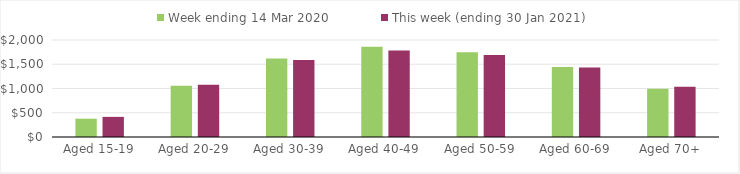
| Category | Week ending 14 Mar 2020 | This week (ending 30 Jan 2021) |
|---|---|---|
| Aged 15-19 | 377.62 | 414.75 |
| Aged 20-29 | 1058.94 | 1078.39 |
| Aged 30-39 | 1618.13 | 1586.17 |
| Aged 40-49 | 1861.32 | 1785.85 |
| Aged 50-59 | 1747.13 | 1690.47 |
| Aged 60-69 | 1443.51 | 1433.45 |
| Aged 70+ | 995.3 | 1035.4 |